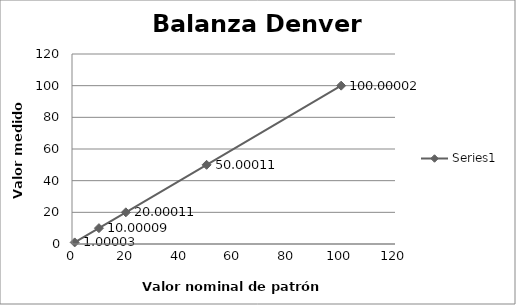
| Category | Series 0 |
|---|---|
| 1.0 | 1 |
| 10.0 | 10 |
| 20.0 | 20 |
| 50.0 | 50 |
| 100.0 | 100 |